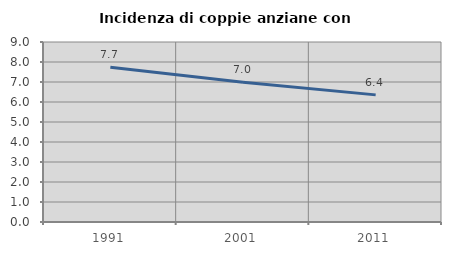
| Category | Incidenza di coppie anziane con figli |
|---|---|
| 1991.0 | 7.742 |
| 2001.0 | 6.985 |
| 2011.0 | 6.356 |